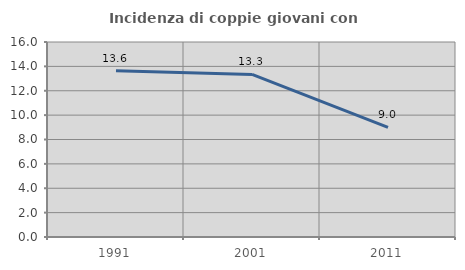
| Category | Incidenza di coppie giovani con figli |
|---|---|
| 1991.0 | 13.642 |
| 2001.0 | 13.341 |
| 2011.0 | 9.002 |